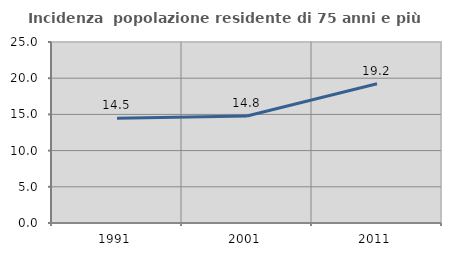
| Category | Incidenza  popolazione residente di 75 anni e più |
|---|---|
| 1991.0 | 14.481 |
| 2001.0 | 14.789 |
| 2011.0 | 19.237 |